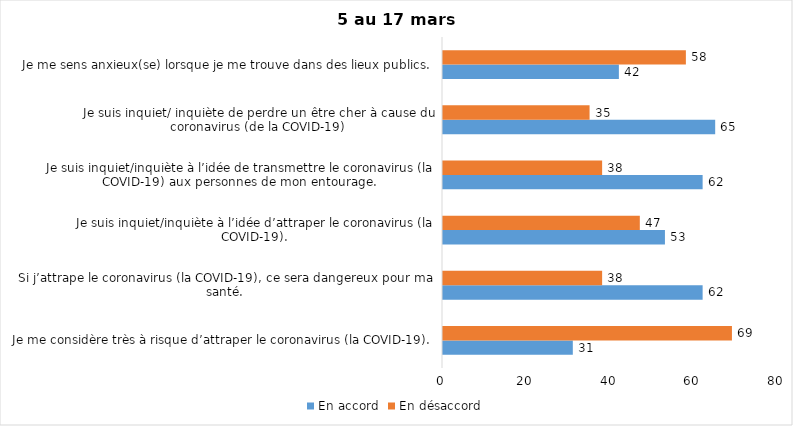
| Category | En accord | En désaccord |
|---|---|---|
| Je me considère très à risque d’attraper le coronavirus (la COVID-19). | 31 | 69 |
| Si j’attrape le coronavirus (la COVID-19), ce sera dangereux pour ma santé. | 62 | 38 |
| Je suis inquiet/inquiète à l’idée d’attraper le coronavirus (la COVID-19). | 53 | 47 |
| Je suis inquiet/inquiète à l’idée de transmettre le coronavirus (la COVID-19) aux personnes de mon entourage. | 62 | 38 |
| Je suis inquiet/ inquiète de perdre un être cher à cause du coronavirus (de la COVID-19) | 65 | 35 |
| Je me sens anxieux(se) lorsque je me trouve dans des lieux publics. | 42 | 58 |